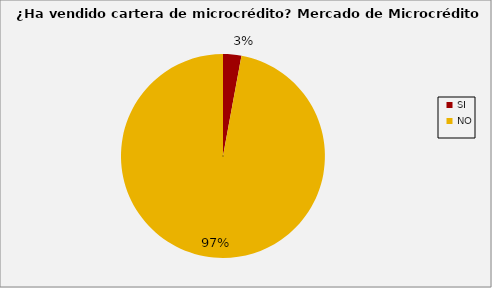
| Category | Series 0 |
|---|---|
| SI | 0.029 |
| NO | 0.971 |